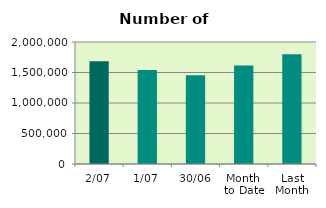
| Category | Series 0 |
|---|---|
| 2/07 | 1685002 |
| 1/07 | 1540834 |
| 30/06 | 1456470 |
| Month 
to Date | 1612918 |
| Last
Month | 1799892.818 |